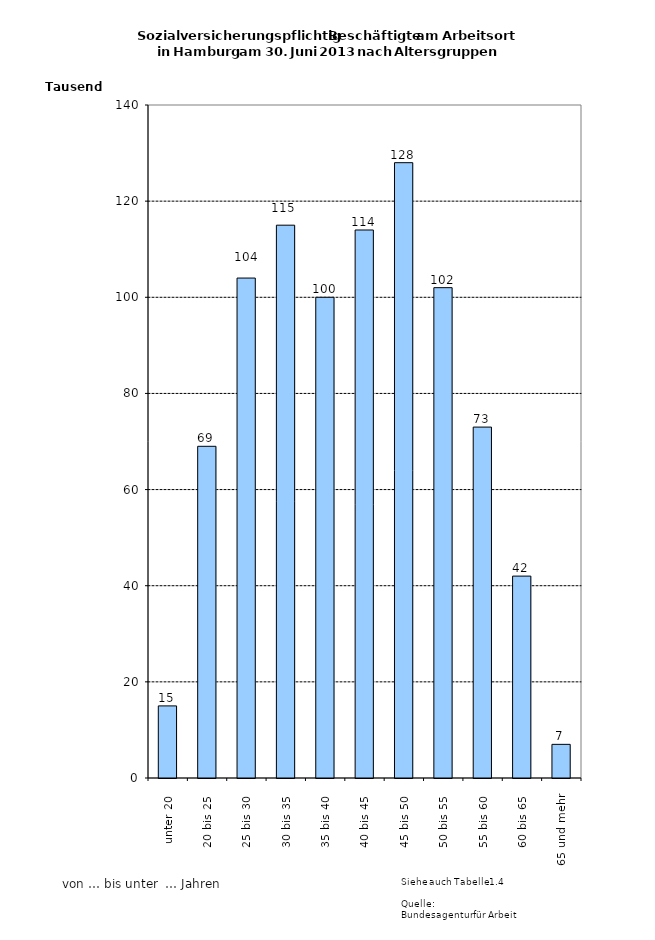
| Category | Series 0 |
|---|---|
| unter 20 | 15000 |
| 20 bis 25 | 69000 |
| 25 bis 30 | 104000 |
| 30 bis 35 | 115000 |
| 35 bis 40 | 100000 |
| 40 bis 45 | 114000 |
| 45 bis 50 | 128000 |
| 50 bis 55 | 102000 |
| 55 bis 60 | 73000 |
| 60 bis 65 | 42000 |
| 65 und mehr | 7000 |